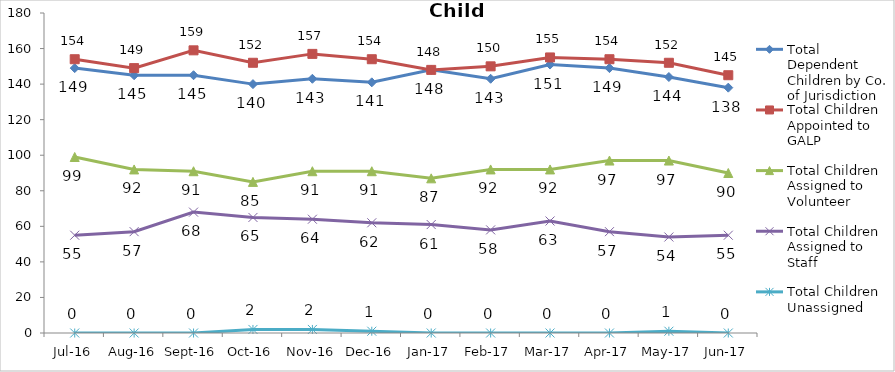
| Category | Total Dependent Children by Co. of Jurisdiction | Total Children Appointed to GALP | Total Children Assigned to Volunteer | Total Children Assigned to Staff | Total Children Unassigned |
|---|---|---|---|---|---|
| Jul-16 | 149 | 154 | 99 | 55 | 0 |
| Aug-16 | 145 | 149 | 92 | 57 | 0 |
| Sep-16 | 145 | 159 | 91 | 68 | 0 |
| Oct-16 | 140 | 152 | 85 | 65 | 2 |
| Nov-16 | 143 | 157 | 91 | 64 | 2 |
| Dec-16 | 141 | 154 | 91 | 62 | 1 |
| Jan-17 | 148 | 148 | 87 | 61 | 0 |
| Feb-17 | 143 | 150 | 92 | 58 | 0 |
| Mar-17 | 151 | 155 | 92 | 63 | 0 |
| Apr-17 | 149 | 154 | 97 | 57 | 0 |
| May-17 | 144 | 152 | 97 | 54 | 1 |
| Jun-17 | 138 | 145 | 90 | 55 | 0 |